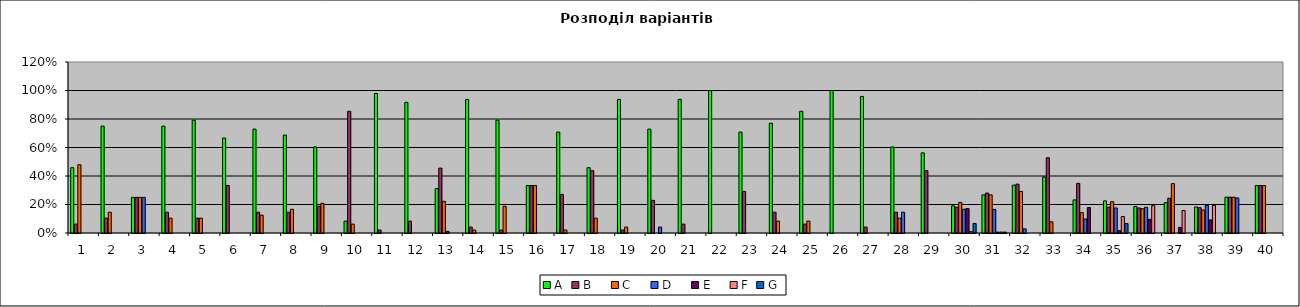
| Category | A | B    | C    | D    | E    | F | G |
|---|---|---|---|---|---|---|---|
| 0 | 0.458 | 0.062 | 0.479 | 0 | 0 | 0 | 0 |
| 1 | 0.75 | 0.104 | 0.146 | 0 | 0 | 0 | 0 |
| 2 | 0.25 | 0.25 | 0.25 | 0.25 | 0 | 0 | 0 |
| 3 | 0.75 | 0.146 | 0.104 | 0 | 0 | 0 | 0 |
| 4 | 0.792 | 0.104 | 0.104 | 0 | 0 | 0 | 0 |
| 5 | 0.667 | 0.333 | 0 | 0 | 0 | 0 | 0 |
| 6 | 0.729 | 0.146 | 0.125 | 0 | 0 | 0 | 0 |
| 7 | 0.688 | 0.146 | 0.167 | 0 | 0 | 0 | 0 |
| 8 | 0.604 | 0.188 | 0.208 | 0 | 0 | 0 | 0 |
| 9 | 0.083 | 0.854 | 0.062 | 0 | 0 | 0 | 0 |
| 10 | 0.979 | 0.021 | 0 | 0 | 0 | 0 | 0 |
| 11 | 0.917 | 0.083 | 0 | 0 | 0 | 0 | 0 |
| 12 | 0.311 | 0.456 | 0.222 | 0.011 | 0 | 0 | 0 |
| 13 | 0.938 | 0.042 | 0.021 | 0 | 0 | 0 | 0 |
| 14 | 0.792 | 0.021 | 0.188 | 0 | 0 | 0 | 0 |
| 15 | 0.333 | 0.333 | 0.333 | 0 | 0 | 0 | 0 |
| 16 | 0.708 | 0.271 | 0.021 | 0 | 0 | 0 | 0 |
| 17 | 0.458 | 0.438 | 0.104 | 0 | 0 | 0 | 0 |
| 18 | 0.938 | 0.021 | 0.042 | 0 | 0 | 0 | 0 |
| 19 | 0.729 | 0.229 | 0 | 0.042 | 0 | 0 | 0 |
| 20 | 0.938 | 0.062 | 0 | 0 | 0 | 0 | 0 |
| 21 | 1 | 0 | 0 | 0 | 0 | 0 | 0 |
| 22 | 0.708 | 0.292 | 0 | 0 | 0 | 0 | 0 |
| 23 | 0.771 | 0.146 | 0.083 | 0 | 0 | 0 | 0 |
| 24 | 0.854 | 0.062 | 0.083 | 0 | 0 | 0 | 0 |
| 25 | 1 | 0 | 0 | 0 | 0 | 0 | 0 |
| 26 | 0.958 | 0.042 | 0 | 0 | 0 | 0 | 0 |
| 27 | 0.604 | 0.146 | 0.104 | 0.146 | 0 | 0 | 0 |
| 28 | 0.562 | 0.438 | 0 | 0 | 0 | 0 | 0 |
| 29 | 0.19 | 0.181 | 0.214 | 0.167 | 0.171 | 0.01 | 0.067 |
| 30 | 0.268 | 0.28 | 0.268 | 0.166 | 0.006 | 0.006 | 0.006 |
| 31 | 0.336 | 0.343 | 0.292 | 0.029 | 0 | 0 | 0 |
| 32 | 0.393 | 0.528 | 0.079 | 0 | 0 | 0 | 0 |
| 33 | 0.232 | 0.348 | 0.143 | 0.098 | 0.179 | 0 | 0 |
| 34 | 0.225 | 0.181 | 0.22 | 0.176 | 0.016 | 0.115 | 0.066 |
| 35 | 0.186 | 0.176 | 0.17 | 0.181 | 0.096 | 0.191 | 0 |
| 36 | 0.213 | 0.244 | 0.346 | 0 | 0.039 | 0.157 | 0 |
| 37 | 0.183 | 0.177 | 0.161 | 0.194 | 0.091 | 0.194 | 0 |
| 38 | 0.251 | 0.251 | 0.251 | 0.246 | 0 | 0 | 0 |
| 39 | 0.333 | 0.333 | 0.333 | 0 | 0 | 0 | 0 |